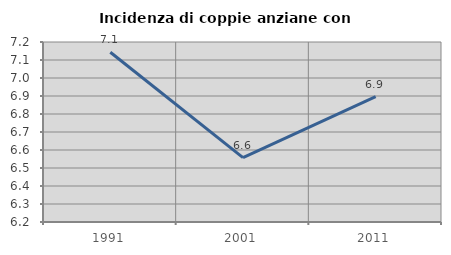
| Category | Incidenza di coppie anziane con figli |
|---|---|
| 1991.0 | 7.143 |
| 2001.0 | 6.557 |
| 2011.0 | 6.897 |